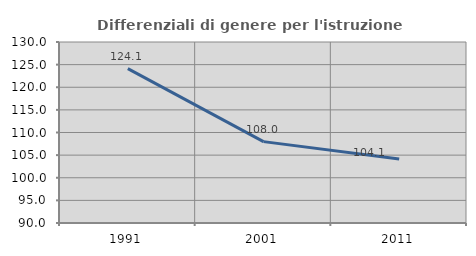
| Category | Differenziali di genere per l'istruzione superiore |
|---|---|
| 1991.0 | 124.107 |
| 2001.0 | 107.982 |
| 2011.0 | 104.119 |